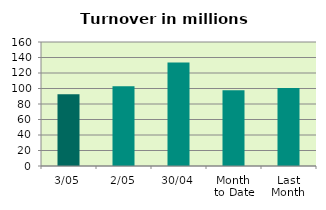
| Category | Series 0 |
|---|---|
| 3/05 | 92.546 |
| 2/05 | 102.923 |
| 30/04 | 133.503 |
| Month 
to Date | 97.734 |
| Last
Month | 100.792 |